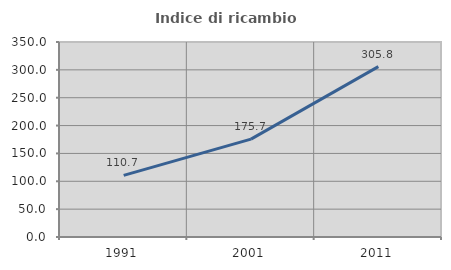
| Category | Indice di ricambio occupazionale  |
|---|---|
| 1991.0 | 110.687 |
| 2001.0 | 175.728 |
| 2011.0 | 305.797 |